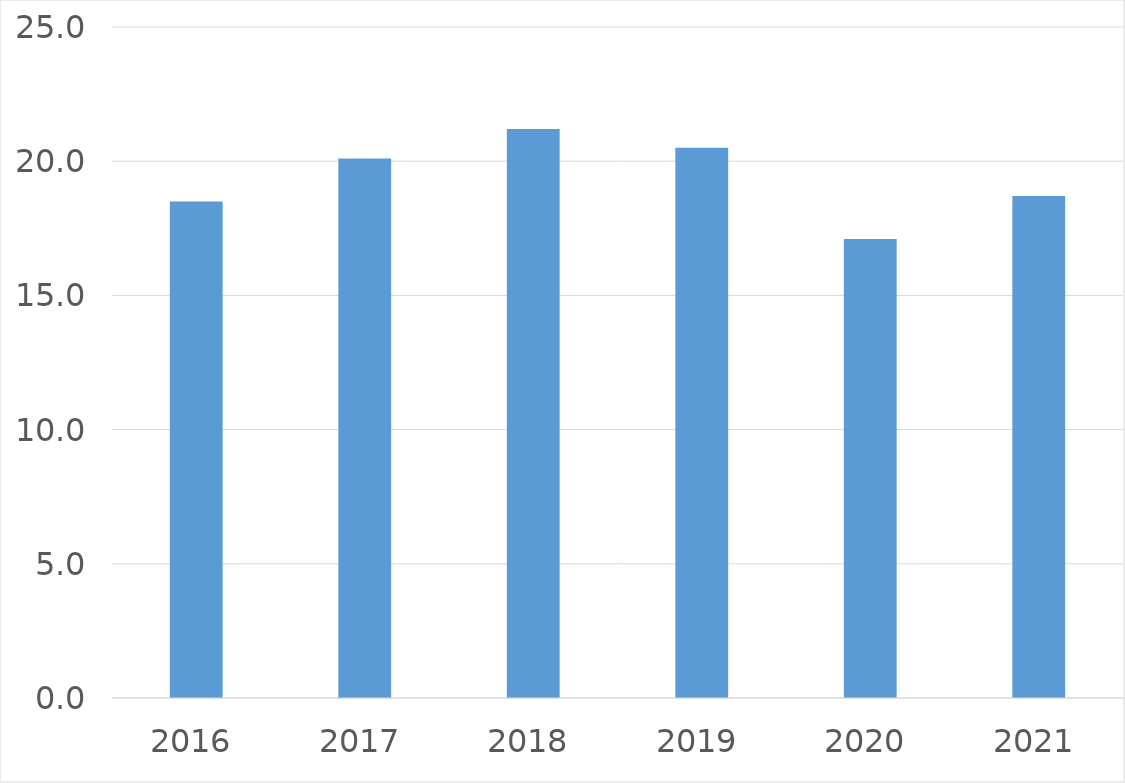
| Category | Series 0 |
|---|---|
| 2016 | 18.5 |
| 2017 | 20.1 |
| 2018 | 21.2 |
| 2019 | 20.5 |
| 2020 | 17.1 |
| 2021 | 18.7 |